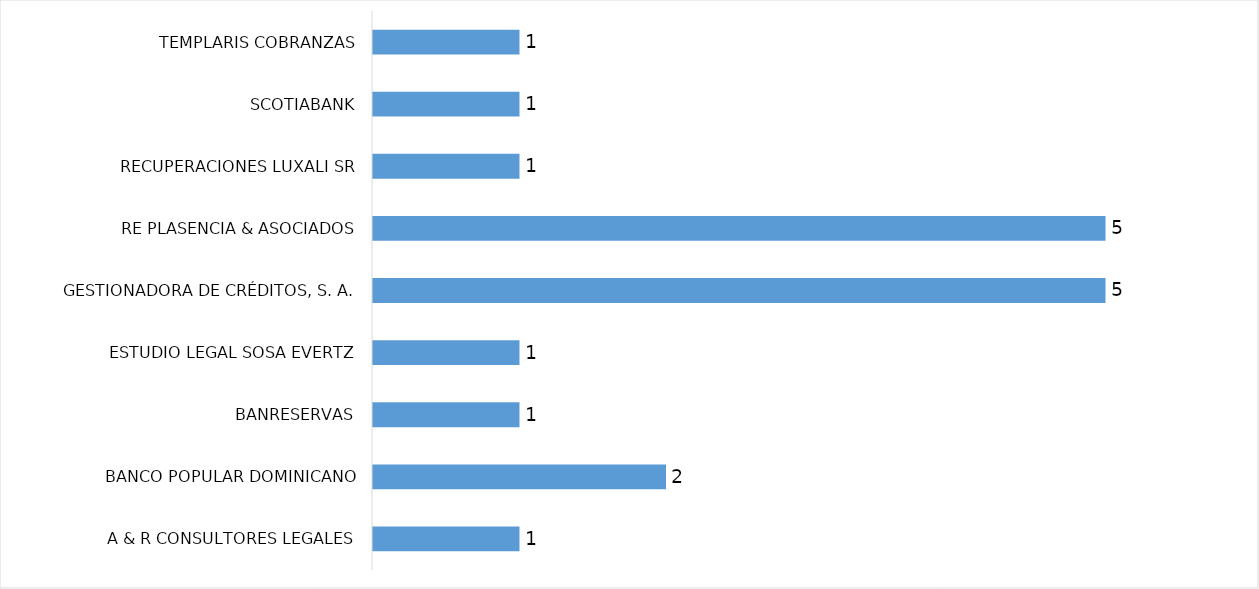
| Category | Series 0 |
|---|---|
| A & R CONSULTORES LEGALES | 1 |
| BANCO POPULAR DOMINICANO | 2 |
| BANRESERVAS | 1 |
| ESTUDIO LEGAL SOSA EVERTZ | 1 |
| GESTIONADORA DE CRÉDITOS, S. A. | 5 |
| RE PLASENCIA & ASOCIADOS | 5 |
| RECUPERACIONES LUXALI SR | 1 |
| SCOTIABANK | 1 |
| TEMPLARIS COBRANZAS | 1 |